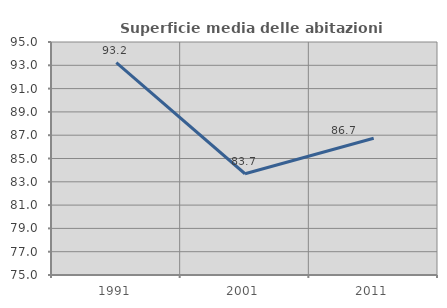
| Category | Superficie media delle abitazioni occupate |
|---|---|
| 1991.0 | 93.231 |
| 2001.0 | 83.691 |
| 2011.0 | 86.744 |